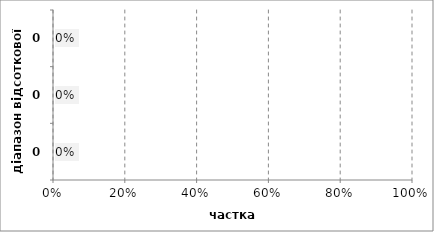
| Category | Series 0 |
|---|---|
| 0.0 | 0 |
| 0.0 | 0 |
| 0.0 | 0 |